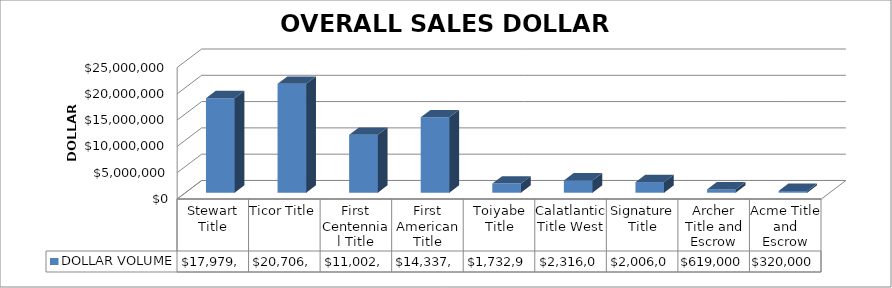
| Category | DOLLAR VOLUME |
|---|---|
| Stewart Title | 17979900 |
| Ticor Title | 20706051 |
| First Centennial Title | 11002900 |
| First American Title | 14337000 |
| Toiyabe Title | 1732900 |
| Calatlantic Title West | 2316082 |
| Signature Title | 2006000 |
| Archer Title and Escrow | 619000 |
| Acme Title and Escrow | 320000 |